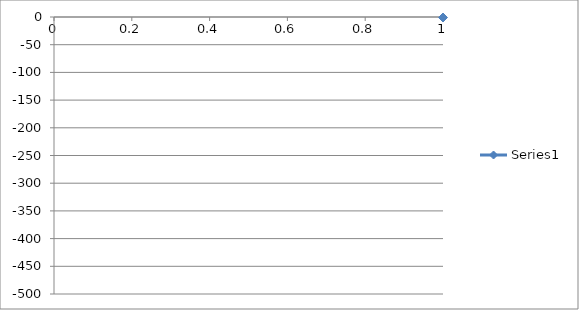
| Category | Series 0 |
|---|---|
| 0 | -0.954 |
| 1 | -1.07 |
| 2 | -1.132 |
| 3 | -1.224 |
| 4 | -1.295 |
| 5 | -1.371 |
| 6 | -1.469 |
| 7 | -1.583 |
| 8 | -1.697 |
| 9 | -1.819 |
| 10 | -1.96 |
| 11 | -2.137 |
| 12 | -2.341 |
| 13 | -2.562 |
| 14 | -2.78 |
| 15 | -3.05 |
| 16 | -3.358 |
| 17 | -3.682 |
| 18 | -4.091 |
| 19 | -4.556 |
| 20 | -5.112 |
| 21 | -5.772 |
| 22 | -6.496 |
| 23 | -7.923 |
| 24 | -8.688 |
| 25 | -10.364 |
| 26 | -12.224 |
| 27 | -14.862 |
| 28 | -17.567 |
| 29 | -21.384 |
| 30 | -26.213 |
| 31 | -28.778 |
| 32 | -31.277 |
| 33 | -34.043 |
| 34 | -37.201 |
| 35 | -40.977 |
| 36 | -45.033 |
| 37 | -49.355 |
| 38 | -54.476 |
| 39 | -60.197 |
| 40 | -66.678 |
| 41 | -73.62 |
| 42 | -81.814 |
| 43 | -90.411 |
| 44 | -99.889 |
| 45 | -110.812 |
| 46 | -122.6 |
| 47 | -135.77 |
| 48 | -149.641 |
| 49 | -164.497 |
| 50 | -180.538 |
| 51 | -197.331 |
| 52 | -214.606 |
| 53 | -232.832 |
| 54 | -251.424 |
| 55 | -270.135 |
| 56 | -288.656 |
| 57 | -306.831 |
| 58 | -324.871 |
| 59 | -342.166 |
| 60 | -358.226 |
| 61 | -373.364 |
| 62 | -387.145 |
| 63 | -399.967 |
| 64 | -411.414 |
| 65 | -421.595 |
| 66 | -430.941 |
| 67 | -438.338 |
| 68 | -445.354 |
| 69 | -451.08 |
| 70 | -455.868 |
| 71 | -459.603 |
| 72 | -462.441 |
| 73 | -464.927 |
| 74 | -466.444 |
| 75 | -467.749 |
| 76 | -468.395 |
| 77 | -468.917 |
| 78 | -469.334 |
| 79 | -469.676 |
| 80 | -469.828 |
| 81 | -469.869 |
| 82 | -469.812 |
| 83 | -469.637 |
| 84 | -469.238 |
| 85 | -468.69 |
| 86 | -467.278 |
| 87 | -465.66 |
| 88 | -463.78 |
| 89 | -460.806 |
| 90 | -456.915 |
| 91 | -452.596 |
| 92 | -446.829 |
| 93 | -440.337 |
| 94 | -432.333 |
| 95 | -423.739 |
| 96 | -413.334 |
| 97 | -401.967 |
| 98 | -389.257 |
| 99 | -374.984 |
| 100 | -360.241 |
| 101 | -343.961 |
| 102 | -327.417 |
| 103 | -309.349 |
| 104 | -291.165 |
| 105 | -272.677 |
| 106 | -253.93 |
| 107 | -235.109 |
| 108 | -217.024 |
| 109 | -199.441 |
| 110 | -182.396 |
| 111 | -166.338 |
| 112 | -151.384 |
| 113 | -137.276 |
| 114 | -124.483 |
| 115 | -112.37 |
| 116 | -101.863 |
| 117 | -92.019 |
| 118 | -82.892 |
| 119 | -75.132 |
| 120 | -67.593 |
| 121 | -61.332 |
| 122 | -56.046 |
| 123 | -50.325 |
| 124 | -46.203 |
| 125 | -42.029 |
| 126 | -38.023 |
| 127 | -35.025 |
| 128 | -31.991 |
| 129 | -29.328 |
| 130 | -26.719 |
| 131 | -22.347 |
| 132 | -18.198 |
| 133 | -15.307 |
| 134 | -12.662 |
| 135 | -10.965 |
| 136 | -9.381 |
| 137 | -8.063 |
| 138 | -7.397 |
| 139 | -6.59 |
| 140 | -5.798 |
| 141 | -5.127 |
| 142 | -4.54 |
| 143 | -4.051 |
| 144 | -3.624 |
| 145 | -3.234 |
| 146 | -2.923 |
| 147 | -2.622 |
| 148 | -2.387 |
| 149 | -2.163 |
| 150 | -1.971 |
| 151 | -1.782 |
| 152 | -1.62 |
| 153 | -1.48 |
| 154 | -1.363 |
| 155 | -1.263 |
| 156 | -1.133 |
| 157 | -1.037 |
| 158 | -0.962 |
| 159 | -0.877 |
| 160 | -0.803 |